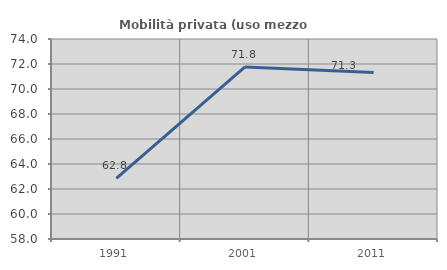
| Category | Mobilità privata (uso mezzo privato) |
|---|---|
| 1991.0 | 62.848 |
| 2001.0 | 71.768 |
| 2011.0 | 71.325 |